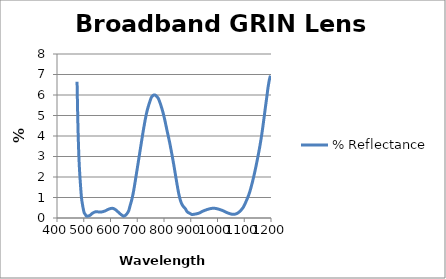
| Category | % Reflectance |
|---|---|
| 475.0 | 6.647 |
| 476.0 | 5.951 |
| 477.0 | 5.262 |
| 478.0 | 4.652 |
| 479.0 | 4.138 |
| 480.0 | 3.684 |
| 481.0 | 3.286 |
| 482.0 | 2.94 |
| 483.0 | 2.647 |
| 484.0 | 2.393 |
| 485.0 | 2.167 |
| 486.0 | 1.959 |
| 487.0 | 1.764 |
| 488.0 | 1.576 |
| 489.0 | 1.394 |
| 490.0 | 1.22 |
| 491.0 | 1.063 |
| 492.0 | 0.935 |
| 493.0 | 0.838 |
| 494.0 | 0.754 |
| 495.0 | 0.676 |
| 496.0 | 0.6 |
| 497.0 | 0.527 |
| 498.0 | 0.457 |
| 499.0 | 0.392 |
| 500.0 | 0.333 |
| 501.0 | 0.285 |
| 502.0 | 0.251 |
| 503.0 | 0.226 |
| 504.0 | 0.205 |
| 505.0 | 0.185 |
| 506.0 | 0.165 |
| 507.0 | 0.145 |
| 508.0 | 0.122 |
| 509.0 | 0.103 |
| 510.0 | 0.094 |
| 511.0 | 0.09 |
| 512.0 | 0.09 |
| 513.0 | 0.09 |
| 514.0 | 0.092 |
| 515.0 | 0.094 |
| 516.0 | 0.096 |
| 517.0 | 0.1 |
| 518.0 | 0.103 |
| 519.0 | 0.107 |
| 520.0 | 0.111 |
| 521.0 | 0.116 |
| 522.0 | 0.122 |
| 523.0 | 0.129 |
| 524.0 | 0.137 |
| 525.0 | 0.147 |
| 526.0 | 0.158 |
| 527.0 | 0.171 |
| 528.0 | 0.184 |
| 529.0 | 0.196 |
| 530.0 | 0.207 |
| 531.0 | 0.218 |
| 532.0 | 0.227 |
| 533.0 | 0.235 |
| 534.0 | 0.244 |
| 535.0 | 0.251 |
| 536.0 | 0.259 |
| 537.0 | 0.266 |
| 538.0 | 0.272 |
| 539.0 | 0.279 |
| 540.0 | 0.285 |
| 541.0 | 0.29 |
| 542.0 | 0.295 |
| 543.0 | 0.299 |
| 544.0 | 0.302 |
| 545.0 | 0.304 |
| 546.0 | 0.306 |
| 547.0 | 0.306 |
| 548.0 | 0.306 |
| 549.0 | 0.306 |
| 550.0 | 0.304 |
| 551.0 | 0.303 |
| 552.0 | 0.301 |
| 553.0 | 0.299 |
| 554.0 | 0.297 |
| 555.0 | 0.296 |
| 556.0 | 0.294 |
| 557.0 | 0.292 |
| 558.0 | 0.291 |
| 559.0 | 0.29 |
| 560.0 | 0.29 |
| 561.0 | 0.289 |
| 562.0 | 0.29 |
| 563.0 | 0.29 |
| 564.0 | 0.291 |
| 565.0 | 0.292 |
| 566.0 | 0.294 |
| 567.0 | 0.296 |
| 568.0 | 0.299 |
| 569.0 | 0.301 |
| 570.0 | 0.304 |
| 571.0 | 0.308 |
| 572.0 | 0.311 |
| 573.0 | 0.314 |
| 574.0 | 0.318 |
| 575.0 | 0.322 |
| 576.0 | 0.327 |
| 577.0 | 0.331 |
| 578.0 | 0.336 |
| 579.0 | 0.341 |
| 580.0 | 0.346 |
| 581.0 | 0.352 |
| 582.0 | 0.358 |
| 583.0 | 0.364 |
| 584.0 | 0.37 |
| 585.0 | 0.377 |
| 586.0 | 0.384 |
| 587.0 | 0.391 |
| 588.0 | 0.398 |
| 589.0 | 0.405 |
| 590.0 | 0.412 |
| 591.0 | 0.418 |
| 592.0 | 0.424 |
| 593.0 | 0.43 |
| 594.0 | 0.435 |
| 595.0 | 0.44 |
| 596.0 | 0.445 |
| 597.0 | 0.449 |
| 598.0 | 0.453 |
| 599.0 | 0.457 |
| 600.0 | 0.46 |
| 601.0 | 0.463 |
| 602.0 | 0.466 |
| 603.0 | 0.468 |
| 604.0 | 0.47 |
| 605.0 | 0.471 |
| 606.0 | 0.471 |
| 607.0 | 0.471 |
| 608.0 | 0.47 |
| 609.0 | 0.468 |
| 610.0 | 0.465 |
| 611.0 | 0.461 |
| 612.0 | 0.456 |
| 613.0 | 0.451 |
| 614.0 | 0.444 |
| 615.0 | 0.437 |
| 616.0 | 0.429 |
| 617.0 | 0.42 |
| 618.0 | 0.411 |
| 619.0 | 0.402 |
| 620.0 | 0.392 |
| 621.0 | 0.381 |
| 622.0 | 0.371 |
| 623.0 | 0.36 |
| 624.0 | 0.348 |
| 625.0 | 0.336 |
| 626.0 | 0.324 |
| 627.0 | 0.312 |
| 628.0 | 0.3 |
| 629.0 | 0.287 |
| 630.0 | 0.275 |
| 631.0 | 0.263 |
| 632.0 | 0.251 |
| 633.0 | 0.239 |
| 634.0 | 0.227 |
| 635.0 | 0.216 |
| 636.0 | 0.205 |
| 637.0 | 0.194 |
| 638.0 | 0.184 |
| 639.0 | 0.174 |
| 640.0 | 0.164 |
| 641.0 | 0.154 |
| 642.0 | 0.145 |
| 643.0 | 0.136 |
| 644.0 | 0.126 |
| 645.0 | 0.118 |
| 646.0 | 0.109 |
| 647.0 | 0.101 |
| 648.0 | 0.093 |
| 649.0 | 0.088 |
| 650.0 | 0.091 |
| 651.0 | 0.096 |
| 652.0 | 0.101 |
| 653.0 | 0.108 |
| 654.0 | 0.115 |
| 655.0 | 0.124 |
| 656.0 | 0.135 |
| 657.0 | 0.146 |
| 658.0 | 0.159 |
| 659.0 | 0.172 |
| 660.0 | 0.187 |
| 661.0 | 0.202 |
| 662.0 | 0.219 |
| 663.0 | 0.236 |
| 664.0 | 0.255 |
| 665.0 | 0.276 |
| 666.0 | 0.298 |
| 667.0 | 0.324 |
| 668.0 | 0.355 |
| 669.0 | 0.392 |
| 670.0 | 0.437 |
| 671.0 | 0.487 |
| 672.0 | 0.539 |
| 673.0 | 0.587 |
| 674.0 | 0.633 |
| 675.0 | 0.678 |
| 676.0 | 0.724 |
| 677.0 | 0.77 |
| 678.0 | 0.817 |
| 679.0 | 0.867 |
| 680.0 | 0.919 |
| 681.0 | 0.974 |
| 682.0 | 1.032 |
| 683.0 | 1.093 |
| 684.0 | 1.156 |
| 685.0 | 1.223 |
| 686.0 | 1.291 |
| 687.0 | 1.363 |
| 688.0 | 1.438 |
| 689.0 | 1.515 |
| 690.0 | 1.595 |
| 691.0 | 1.676 |
| 692.0 | 1.758 |
| 693.0 | 1.84 |
| 694.0 | 1.922 |
| 695.0 | 2.003 |
| 696.0 | 2.084 |
| 697.0 | 2.166 |
| 698.0 | 2.247 |
| 699.0 | 2.329 |
| 700.0 | 2.411 |
| 701.0 | 2.493 |
| 702.0 | 2.575 |
| 703.0 | 2.658 |
| 704.0 | 2.74 |
| 705.0 | 2.823 |
| 706.0 | 2.906 |
| 707.0 | 2.989 |
| 708.0 | 3.072 |
| 709.0 | 3.155 |
| 710.0 | 3.238 |
| 711.0 | 3.32 |
| 712.0 | 3.403 |
| 713.0 | 3.485 |
| 714.0 | 3.568 |
| 715.0 | 3.65 |
| 716.0 | 3.731 |
| 717.0 | 3.812 |
| 718.0 | 3.894 |
| 719.0 | 3.974 |
| 720.0 | 4.054 |
| 721.0 | 4.134 |
| 722.0 | 4.213 |
| 723.0 | 4.291 |
| 724.0 | 4.369 |
| 725.0 | 4.446 |
| 726.0 | 4.521 |
| 727.0 | 4.596 |
| 728.0 | 4.669 |
| 729.0 | 4.74 |
| 730.0 | 4.81 |
| 731.0 | 4.878 |
| 732.0 | 4.943 |
| 733.0 | 5.007 |
| 734.0 | 5.068 |
| 735.0 | 5.127 |
| 736.0 | 5.182 |
| 737.0 | 5.236 |
| 738.0 | 5.287 |
| 739.0 | 5.335 |
| 740.0 | 5.382 |
| 741.0 | 5.427 |
| 742.0 | 5.471 |
| 743.0 | 5.515 |
| 744.0 | 5.557 |
| 745.0 | 5.599 |
| 746.0 | 5.64 |
| 747.0 | 5.68 |
| 748.0 | 5.719 |
| 749.0 | 5.757 |
| 750.0 | 5.794 |
| 751.0 | 5.829 |
| 752.0 | 5.86 |
| 753.0 | 5.885 |
| 754.0 | 5.905 |
| 755.0 | 5.923 |
| 756.0 | 5.94 |
| 757.0 | 5.954 |
| 758.0 | 5.967 |
| 759.0 | 5.978 |
| 760.0 | 5.987 |
| 761.0 | 5.995 |
| 762.0 | 6 |
| 763.0 | 6.004 |
| 764.0 | 6.005 |
| 765.0 | 6.004 |
| 766.0 | 6.001 |
| 767.0 | 5.995 |
| 768.0 | 5.988 |
| 769.0 | 5.978 |
| 770.0 | 5.968 |
| 771.0 | 5.956 |
| 772.0 | 5.943 |
| 773.0 | 5.929 |
| 774.0 | 5.914 |
| 775.0 | 5.898 |
| 776.0 | 5.882 |
| 777.0 | 5.865 |
| 778.0 | 5.846 |
| 779.0 | 5.822 |
| 780.0 | 5.795 |
| 781.0 | 5.764 |
| 782.0 | 5.731 |
| 783.0 | 5.696 |
| 784.0 | 5.66 |
| 785.0 | 5.624 |
| 786.0 | 5.586 |
| 787.0 | 5.548 |
| 788.0 | 5.508 |
| 789.0 | 5.468 |
| 790.0 | 5.427 |
| 791.0 | 5.385 |
| 792.0 | 5.342 |
| 793.0 | 5.298 |
| 794.0 | 5.252 |
| 795.0 | 5.206 |
| 796.0 | 5.158 |
| 797.0 | 5.108 |
| 798.0 | 5.057 |
| 799.0 | 5.004 |
| 800.0 | 4.95 |
| 801.0 | 4.894 |
| 802.0 | 4.837 |
| 803.0 | 4.778 |
| 804.0 | 4.719 |
| 805.0 | 4.658 |
| 806.0 | 4.597 |
| 807.0 | 4.535 |
| 808.0 | 4.473 |
| 809.0 | 4.411 |
| 810.0 | 4.349 |
| 811.0 | 4.288 |
| 812.0 | 4.227 |
| 813.0 | 4.168 |
| 814.0 | 4.109 |
| 815.0 | 4.05 |
| 816.0 | 3.992 |
| 817.0 | 3.932 |
| 818.0 | 3.873 |
| 819.0 | 3.812 |
| 820.0 | 3.75 |
| 821.0 | 3.687 |
| 822.0 | 3.622 |
| 823.0 | 3.557 |
| 824.0 | 3.49 |
| 825.0 | 3.422 |
| 826.0 | 3.354 |
| 827.0 | 3.284 |
| 828.0 | 3.214 |
| 829.0 | 3.144 |
| 830.0 | 3.073 |
| 831.0 | 3.002 |
| 832.0 | 2.929 |
| 833.0 | 2.857 |
| 834.0 | 2.784 |
| 835.0 | 2.71 |
| 836.0 | 2.635 |
| 837.0 | 2.56 |
| 838.0 | 2.484 |
| 839.0 | 2.406 |
| 840.0 | 2.328 |
| 841.0 | 2.25 |
| 842.0 | 2.17 |
| 843.0 | 2.091 |
| 844.0 | 2.012 |
| 845.0 | 1.934 |
| 846.0 | 1.856 |
| 847.0 | 1.778 |
| 848.0 | 1.701 |
| 849.0 | 1.625 |
| 850.0 | 1.55 |
| 851.0 | 1.476 |
| 852.0 | 1.403 |
| 853.0 | 1.332 |
| 854.0 | 1.263 |
| 855.0 | 1.197 |
| 856.0 | 1.134 |
| 857.0 | 1.074 |
| 858.0 | 1.019 |
| 859.0 | 0.968 |
| 860.0 | 0.92 |
| 861.0 | 0.876 |
| 862.0 | 0.835 |
| 863.0 | 0.797 |
| 864.0 | 0.761 |
| 865.0 | 0.729 |
| 866.0 | 0.699 |
| 867.0 | 0.672 |
| 868.0 | 0.648 |
| 869.0 | 0.625 |
| 870.0 | 0.605 |
| 871.0 | 0.586 |
| 872.0 | 0.568 |
| 873.0 | 0.551 |
| 874.0 | 0.536 |
| 875.0 | 0.52 |
| 876.0 | 0.506 |
| 877.0 | 0.492 |
| 878.0 | 0.478 |
| 879.0 | 0.464 |
| 880.0 | 0.449 |
| 881.0 | 0.426 |
| 882.0 | 0.4 |
| 883.0 | 0.377 |
| 884.0 | 0.354 |
| 885.0 | 0.333 |
| 886.0 | 0.314 |
| 887.0 | 0.298 |
| 888.0 | 0.287 |
| 889.0 | 0.278 |
| 890.0 | 0.269 |
| 891.0 | 0.262 |
| 892.0 | 0.255 |
| 893.0 | 0.248 |
| 894.0 | 0.241 |
| 895.0 | 0.234 |
| 896.0 | 0.228 |
| 897.0 | 0.221 |
| 898.0 | 0.214 |
| 899.0 | 0.208 |
| 900.0 | 0.201 |
| 901.0 | 0.194 |
| 902.0 | 0.187 |
| 903.0 | 0.18 |
| 904.0 | 0.173 |
| 905.0 | 0.17 |
| 906.0 | 0.17 |
| 907.0 | 0.172 |
| 908.0 | 0.173 |
| 909.0 | 0.175 |
| 910.0 | 0.177 |
| 911.0 | 0.179 |
| 912.0 | 0.181 |
| 913.0 | 0.183 |
| 914.0 | 0.185 |
| 915.0 | 0.188 |
| 916.0 | 0.19 |
| 917.0 | 0.192 |
| 918.0 | 0.195 |
| 919.0 | 0.197 |
| 920.0 | 0.2 |
| 921.0 | 0.202 |
| 922.0 | 0.205 |
| 923.0 | 0.208 |
| 924.0 | 0.212 |
| 925.0 | 0.215 |
| 926.0 | 0.218 |
| 927.0 | 0.222 |
| 928.0 | 0.226 |
| 929.0 | 0.23 |
| 930.0 | 0.235 |
| 931.0 | 0.24 |
| 932.0 | 0.245 |
| 933.0 | 0.251 |
| 934.0 | 0.257 |
| 935.0 | 0.264 |
| 936.0 | 0.27 |
| 937.0 | 0.277 |
| 938.0 | 0.284 |
| 939.0 | 0.292 |
| 940.0 | 0.299 |
| 941.0 | 0.306 |
| 942.0 | 0.312 |
| 943.0 | 0.319 |
| 944.0 | 0.325 |
| 945.0 | 0.331 |
| 946.0 | 0.337 |
| 947.0 | 0.343 |
| 948.0 | 0.348 |
| 949.0 | 0.354 |
| 950.0 | 0.359 |
| 951.0 | 0.364 |
| 952.0 | 0.37 |
| 953.0 | 0.374 |
| 954.0 | 0.379 |
| 955.0 | 0.384 |
| 956.0 | 0.389 |
| 957.0 | 0.394 |
| 958.0 | 0.398 |
| 959.0 | 0.403 |
| 960.0 | 0.407 |
| 961.0 | 0.412 |
| 962.0 | 0.416 |
| 963.0 | 0.42 |
| 964.0 | 0.424 |
| 965.0 | 0.428 |
| 966.0 | 0.432 |
| 967.0 | 0.436 |
| 968.0 | 0.44 |
| 969.0 | 0.443 |
| 970.0 | 0.447 |
| 971.0 | 0.45 |
| 972.0 | 0.453 |
| 973.0 | 0.456 |
| 974.0 | 0.458 |
| 975.0 | 0.461 |
| 976.0 | 0.463 |
| 977.0 | 0.466 |
| 978.0 | 0.468 |
| 979.0 | 0.469 |
| 980.0 | 0.471 |
| 981.0 | 0.472 |
| 982.0 | 0.473 |
| 983.0 | 0.474 |
| 984.0 | 0.474 |
| 985.0 | 0.474 |
| 986.0 | 0.474 |
| 987.0 | 0.474 |
| 988.0 | 0.473 |
| 989.0 | 0.472 |
| 990.0 | 0.471 |
| 991.0 | 0.47 |
| 992.0 | 0.468 |
| 993.0 | 0.466 |
| 994.0 | 0.463 |
| 995.0 | 0.461 |
| 996.0 | 0.458 |
| 997.0 | 0.455 |
| 998.0 | 0.452 |
| 999.0 | 0.449 |
| 1000.0 | 0.446 |
| 1001.0 | 0.442 |
| 1002.0 | 0.438 |
| 1003.0 | 0.435 |
| 1004.0 | 0.431 |
| 1005.0 | 0.427 |
| 1006.0 | 0.423 |
| 1007.0 | 0.419 |
| 1008.0 | 0.415 |
| 1009.0 | 0.411 |
| 1010.0 | 0.407 |
| 1011.0 | 0.402 |
| 1012.0 | 0.398 |
| 1013.0 | 0.393 |
| 1014.0 | 0.389 |
| 1015.0 | 0.384 |
| 1016.0 | 0.379 |
| 1017.0 | 0.374 |
| 1018.0 | 0.368 |
| 1019.0 | 0.363 |
| 1020.0 | 0.357 |
| 1021.0 | 0.352 |
| 1022.0 | 0.346 |
| 1023.0 | 0.34 |
| 1024.0 | 0.333 |
| 1025.0 | 0.327 |
| 1026.0 | 0.32 |
| 1027.0 | 0.314 |
| 1028.0 | 0.308 |
| 1029.0 | 0.301 |
| 1030.0 | 0.295 |
| 1031.0 | 0.289 |
| 1032.0 | 0.282 |
| 1033.0 | 0.276 |
| 1034.0 | 0.27 |
| 1035.0 | 0.265 |
| 1036.0 | 0.259 |
| 1037.0 | 0.254 |
| 1038.0 | 0.248 |
| 1039.0 | 0.243 |
| 1040.0 | 0.238 |
| 1041.0 | 0.234 |
| 1042.0 | 0.229 |
| 1043.0 | 0.224 |
| 1044.0 | 0.22 |
| 1045.0 | 0.215 |
| 1046.0 | 0.211 |
| 1047.0 | 0.207 |
| 1048.0 | 0.203 |
| 1049.0 | 0.2 |
| 1050.0 | 0.196 |
| 1051.0 | 0.192 |
| 1052.0 | 0.189 |
| 1053.0 | 0.186 |
| 1054.0 | 0.184 |
| 1055.0 | 0.182 |
| 1056.0 | 0.18 |
| 1057.0 | 0.179 |
| 1058.0 | 0.178 |
| 1059.0 | 0.178 |
| 1060.0 | 0.178 |
| 1061.0 | 0.179 |
| 1062.0 | 0.18 |
| 1063.0 | 0.182 |
| 1064.0 | 0.184 |
| 1065.0 | 0.187 |
| 1066.0 | 0.19 |
| 1067.0 | 0.193 |
| 1068.0 | 0.197 |
| 1069.0 | 0.202 |
| 1070.0 | 0.206 |
| 1071.0 | 0.211 |
| 1072.0 | 0.217 |
| 1073.0 | 0.223 |
| 1074.0 | 0.23 |
| 1075.0 | 0.237 |
| 1076.0 | 0.245 |
| 1077.0 | 0.254 |
| 1078.0 | 0.263 |
| 1079.0 | 0.273 |
| 1080.0 | 0.284 |
| 1081.0 | 0.295 |
| 1082.0 | 0.307 |
| 1083.0 | 0.319 |
| 1084.0 | 0.332 |
| 1085.0 | 0.344 |
| 1086.0 | 0.357 |
| 1087.0 | 0.37 |
| 1088.0 | 0.384 |
| 1089.0 | 0.398 |
| 1090.0 | 0.413 |
| 1091.0 | 0.428 |
| 1092.0 | 0.445 |
| 1093.0 | 0.461 |
| 1094.0 | 0.479 |
| 1095.0 | 0.498 |
| 1096.0 | 0.518 |
| 1097.0 | 0.539 |
| 1098.0 | 0.562 |
| 1099.0 | 0.586 |
| 1100.0 | 0.612 |
| 1101.0 | 0.638 |
| 1102.0 | 0.666 |
| 1103.0 | 0.695 |
| 1104.0 | 0.724 |
| 1105.0 | 0.754 |
| 1106.0 | 0.784 |
| 1107.0 | 0.814 |
| 1108.0 | 0.844 |
| 1109.0 | 0.874 |
| 1110.0 | 0.904 |
| 1111.0 | 0.935 |
| 1112.0 | 0.966 |
| 1113.0 | 0.998 |
| 1114.0 | 1.031 |
| 1115.0 | 1.064 |
| 1116.0 | 1.099 |
| 1117.0 | 1.135 |
| 1118.0 | 1.172 |
| 1119.0 | 1.211 |
| 1120.0 | 1.252 |
| 1121.0 | 1.294 |
| 1122.0 | 1.337 |
| 1123.0 | 1.382 |
| 1124.0 | 1.428 |
| 1125.0 | 1.475 |
| 1126.0 | 1.524 |
| 1127.0 | 1.573 |
| 1128.0 | 1.623 |
| 1129.0 | 1.674 |
| 1130.0 | 1.726 |
| 1131.0 | 1.778 |
| 1132.0 | 1.831 |
| 1133.0 | 1.884 |
| 1134.0 | 1.939 |
| 1135.0 | 1.994 |
| 1136.0 | 2.05 |
| 1137.0 | 2.108 |
| 1138.0 | 2.165 |
| 1139.0 | 2.224 |
| 1140.0 | 2.284 |
| 1141.0 | 2.344 |
| 1142.0 | 2.406 |
| 1143.0 | 2.468 |
| 1144.0 | 2.53 |
| 1145.0 | 2.594 |
| 1146.0 | 2.658 |
| 1147.0 | 2.722 |
| 1148.0 | 2.787 |
| 1149.0 | 2.853 |
| 1150.0 | 2.919 |
| 1151.0 | 2.986 |
| 1152.0 | 3.054 |
| 1153.0 | 3.122 |
| 1154.0 | 3.191 |
| 1155.0 | 3.261 |
| 1156.0 | 3.331 |
| 1157.0 | 3.403 |
| 1158.0 | 3.476 |
| 1159.0 | 3.55 |
| 1160.0 | 3.626 |
| 1161.0 | 3.704 |
| 1162.0 | 3.783 |
| 1163.0 | 3.865 |
| 1164.0 | 3.948 |
| 1165.0 | 4.034 |
| 1166.0 | 4.123 |
| 1167.0 | 4.213 |
| 1168.0 | 4.306 |
| 1169.0 | 4.4 |
| 1170.0 | 4.496 |
| 1171.0 | 4.594 |
| 1172.0 | 4.692 |
| 1173.0 | 4.792 |
| 1174.0 | 4.892 |
| 1175.0 | 4.992 |
| 1176.0 | 5.093 |
| 1177.0 | 5.193 |
| 1178.0 | 5.293 |
| 1179.0 | 5.392 |
| 1180.0 | 5.489 |
| 1181.0 | 5.586 |
| 1182.0 | 5.681 |
| 1183.0 | 5.777 |
| 1184.0 | 5.873 |
| 1185.0 | 5.971 |
| 1186.0 | 6.075 |
| 1187.0 | 6.182 |
| 1188.0 | 6.282 |
| 1189.0 | 6.372 |
| 1190.0 | 6.456 |
| 1191.0 | 6.536 |
| 1192.0 | 6.611 |
| 1193.0 | 6.682 |
| 1194.0 | 6.748 |
| 1195.0 | 6.806 |
| 1196.0 | 6.858 |
| 1197.0 | 6.903 |
| 1198.0 | 6.945 |